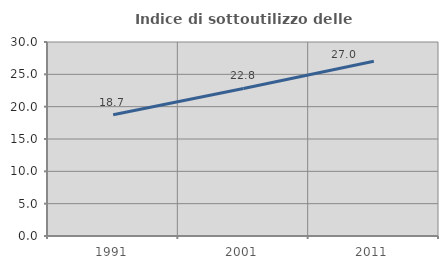
| Category | Indice di sottoutilizzo delle abitazioni  |
|---|---|
| 1991.0 | 18.738 |
| 2001.0 | 22.816 |
| 2011.0 | 27.023 |